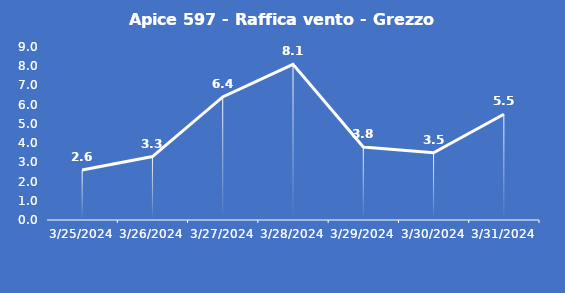
| Category | Apice 597 - Raffica vento - Grezzo (m/s) |
|---|---|
| 3/25/24 | 2.6 |
| 3/26/24 | 3.3 |
| 3/27/24 | 6.4 |
| 3/28/24 | 8.1 |
| 3/29/24 | 3.8 |
| 3/30/24 | 3.5 |
| 3/31/24 | 5.5 |